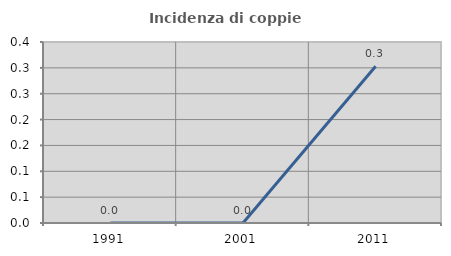
| Category | Incidenza di coppie miste |
|---|---|
| 1991.0 | 0 |
| 2001.0 | 0 |
| 2011.0 | 0.303 |